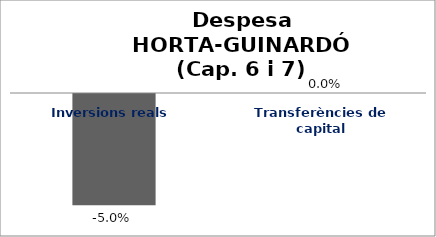
| Category | Series 0 |
|---|---|
| Inversions reals | -0.05 |
| Transferències de capital | 0 |